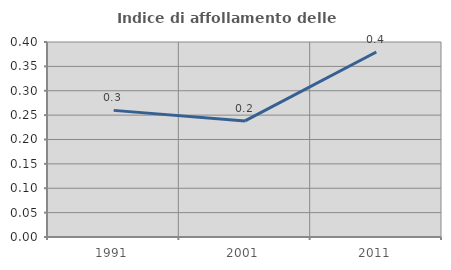
| Category | Indice di affollamento delle abitazioni  |
|---|---|
| 1991.0 | 0.26 |
| 2001.0 | 0.238 |
| 2011.0 | 0.38 |